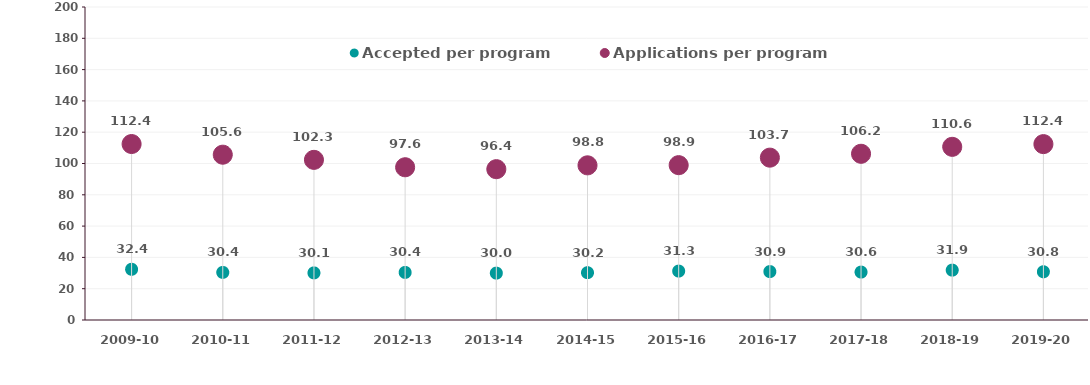
| Category | Accepted per program | Applications per program |
|---|---|---|
| 2009-10 | 32.405 | 112.443 |
| 2010-11 | 30.406 | 105.625 |
| 2011-12 | 30.096 | 102.325 |
| 2012-13 | 30.403 | 97.603 |
| 2013-14 | 29.955 | 96.374 |
| 2014-15 | 30.236 | 98.827 |
| 2015-16 | 31.266 | 98.937 |
| 2016-17 | 30.93 | 103.739 |
| 2017-18 | 30.62 | 106.204 |
| 2018-19 | 31.865 | 110.649 |
| 2019-20 | 30.816 | 112.383 |